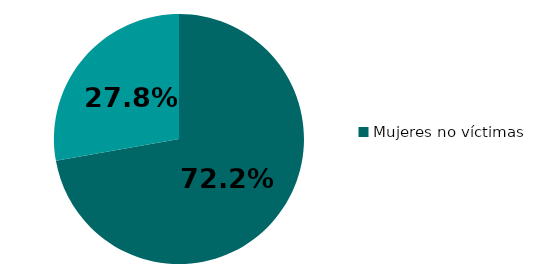
| Category | Mujeres no víctimas |
|---|---|
| 0 | 72.212 |
| 1 | 27.788 |